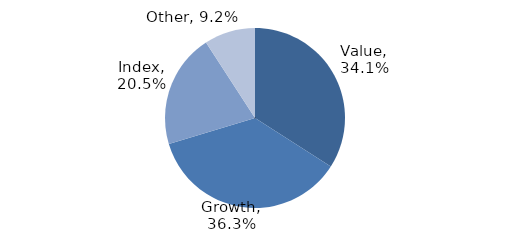
| Category | Investment Style |
|---|---|
| Value | 0.341 |
| Growth | 0.363 |
| Index | 0.205 |
| Other | 0.092 |